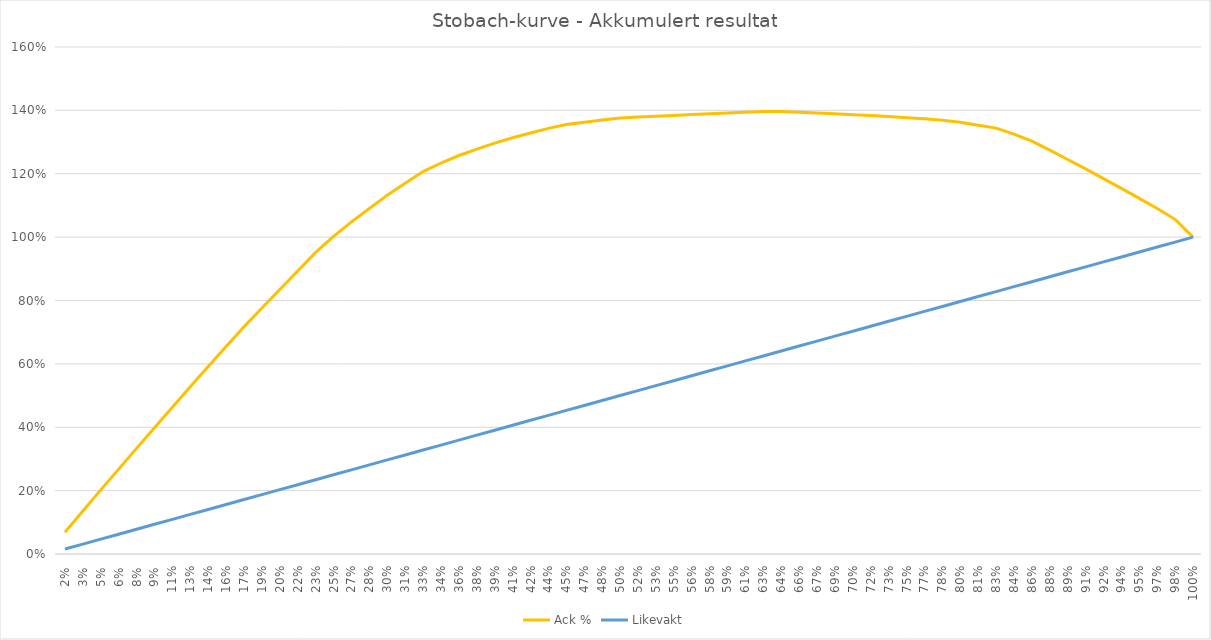
| Category | Ack % | Likevakt |
|---|---|---|
| 0.015625 | 0.069 | 0.016 |
| 0.03125 | 0.136 | 0.031 |
| 0.046875 | 0.202 | 0.047 |
| 0.0625 | 0.268 | 0.062 |
| 0.078125 | 0.333 | 0.078 |
| 0.09375 | 0.399 | 0.094 |
| 0.109375 | 0.463 | 0.109 |
| 0.125 | 0.528 | 0.125 |
| 0.140625 | 0.592 | 0.141 |
| 0.15625 | 0.655 | 0.156 |
| 0.171875 | 0.717 | 0.172 |
| 0.1875 | 0.776 | 0.188 |
| 0.203125 | 0.835 | 0.203 |
| 0.21875 | 0.893 | 0.219 |
| 0.234375 | 0.952 | 0.234 |
| 0.25 | 1.002 | 0.25 |
| 0.265625 | 1.048 | 0.266 |
| 0.28125 | 1.09 | 0.281 |
| 0.296875 | 1.133 | 0.297 |
| 0.3125 | 1.17 | 0.312 |
| 0.328125 | 1.207 | 0.328 |
| 0.34375 | 1.234 | 0.344 |
| 0.359375 | 1.258 | 0.359 |
| 0.375 | 1.278 | 0.375 |
| 0.390625 | 1.297 | 0.391 |
| 0.40625 | 1.314 | 0.406 |
| 0.421875 | 1.329 | 0.422 |
| 0.4375 | 1.343 | 0.438 |
| 0.453125 | 1.355 | 0.453 |
| 0.46875 | 1.363 | 0.469 |
| 0.484375 | 1.37 | 0.484 |
| 0.5 | 1.376 | 0.5 |
| 0.515625 | 1.379 | 0.516 |
| 0.53125 | 1.382 | 0.531 |
| 0.546875 | 1.384 | 0.547 |
| 0.5625 | 1.387 | 0.562 |
| 0.578125 | 1.389 | 0.578 |
| 0.59375 | 1.392 | 0.594 |
| 0.609375 | 1.394 | 0.609 |
| 0.625 | 1.396 | 0.625 |
| 0.640625 | 1.396 | 0.641 |
| 0.65625 | 1.394 | 0.656 |
| 0.671875 | 1.392 | 0.672 |
| 0.6875 | 1.389 | 0.688 |
| 0.703125 | 1.386 | 0.703 |
| 0.71875 | 1.384 | 0.719 |
| 0.734375 | 1.38 | 0.734 |
| 0.75 | 1.377 | 0.75 |
| 0.765625 | 1.373 | 0.766 |
| 0.78125 | 1.369 | 0.781 |
| 0.796875 | 1.363 | 0.797 |
| 0.8125 | 1.353 | 0.812 |
| 0.828125 | 1.344 | 0.828 |
| 0.84375 | 1.325 | 0.844 |
| 0.859375 | 1.303 | 0.859 |
| 0.875 | 1.275 | 0.875 |
| 0.890625 | 1.245 | 0.891 |
| 0.90625 | 1.215 | 0.906 |
| 0.921875 | 1.185 | 0.922 |
| 0.9375 | 1.154 | 0.938 |
| 0.953125 | 1.122 | 0.953 |
| 0.96875 | 1.09 | 0.969 |
| 0.984375 | 1.056 | 0.984 |
| 1.0 | 1 | 1 |